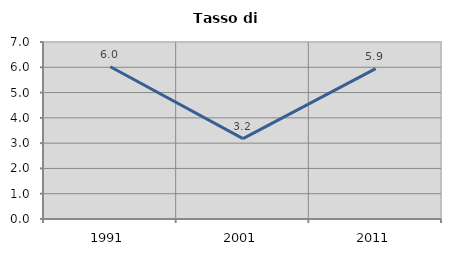
| Category | Tasso di disoccupazione   |
|---|---|
| 1991.0 | 6.02 |
| 2001.0 | 3.178 |
| 2011.0 | 5.947 |